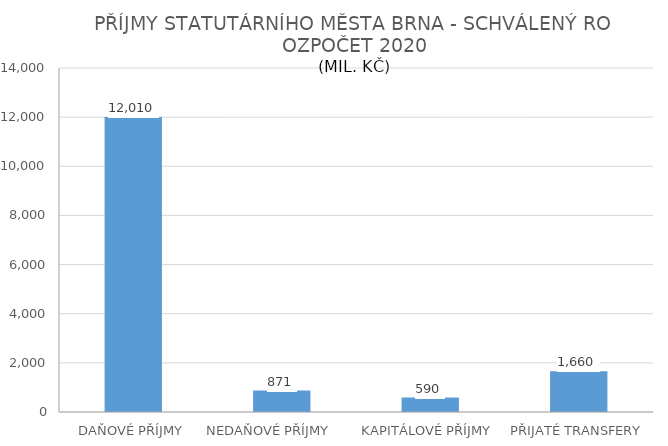
| Category | Series 0 |
|---|---|
| DAŇOVÉ PŘÍJMY | 12010.493 |
| NEDAŇOVÉ PŘÍJMY              | 871.296 |
| KAPITÁLOVÉ PŘÍJMY  | 590.036 |
| PŘIJATÉ TRANSFERY | 1660.425 |